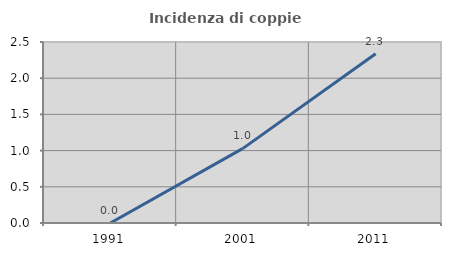
| Category | Incidenza di coppie miste |
|---|---|
| 1991.0 | 0 |
| 2001.0 | 1.031 |
| 2011.0 | 2.338 |